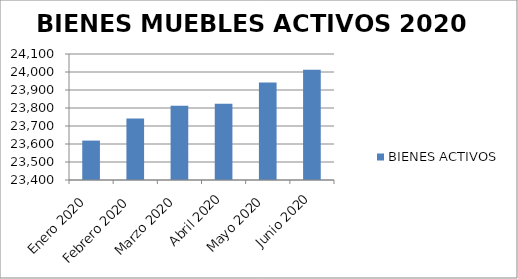
| Category | BIENES ACTIVOS |
|---|---|
| Enero 2020 | 23619 |
| Febrero 2020 | 23742 |
| Marzo 2020 | 23812 |
| Abril 2020 | 23824 |
| Mayo 2020 | 23942 |
| Junio 2020 | 24012 |